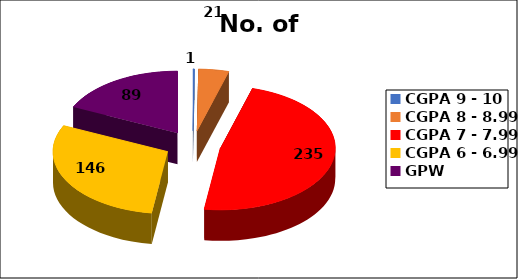
| Category | No. of Students |
|---|---|
| CGPA 9 - 10 | 1 |
| CGPA 8 - 8.99 | 21 |
| CGPA 7 - 7.99 | 235 |
| CGPA 6 - 6.99 | 146 |
| GPW | 89 |